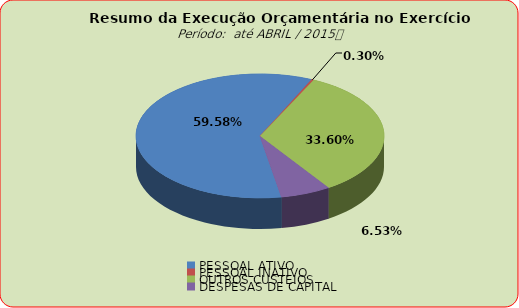
| Category | Series 0 |
|---|---|
| PESSOAL ATIVO | 39957423.81 |
| PESSOAL INATIVO | 198122.49 |
| OUTROS CUSTEIOS | 22532655.31 |
| DESPESAS DE CAPITAL | 4377986.02 |